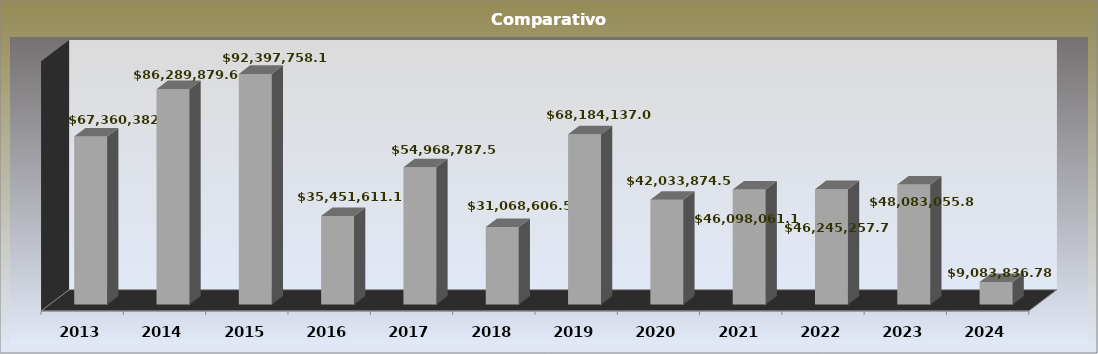
| Category | Series 0 |
|---|---|
| 2013.0 | 67360382.57 |
| 2014.0 | 86289879.62 |
| 2015.0 | 92397758.15 |
| 2016.0 | 35451611.18 |
| 2017.0 | 54968787.54 |
| 2018.0 | 31068606.51 |
| 2019.0 | 68184137.03 |
| 2020.0 | 42033874.55 |
| 2021.0 | 46098061.14 |
| 2022.0 | 46245257.72 |
| 2023.0 | 48083055.84 |
| 2024.0 | 9083836.78 |